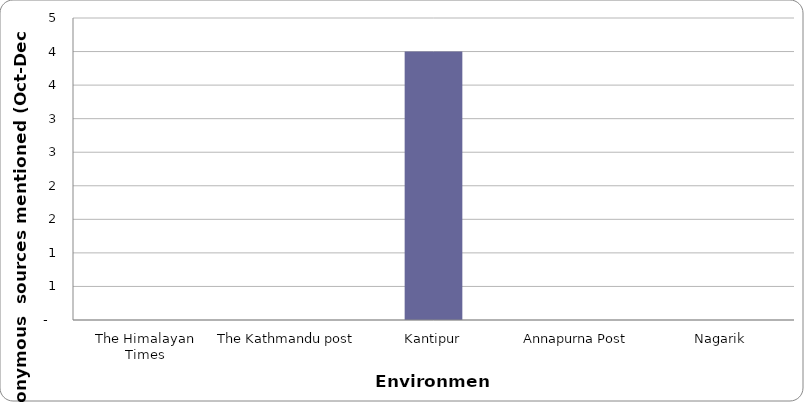
| Category | Environment |
|---|---|
| The Himalayan Times | 0 |
| The Kathmandu post | 0 |
| Kantipur | 4 |
| Annapurna Post | 0 |
| Nagarik | 0 |